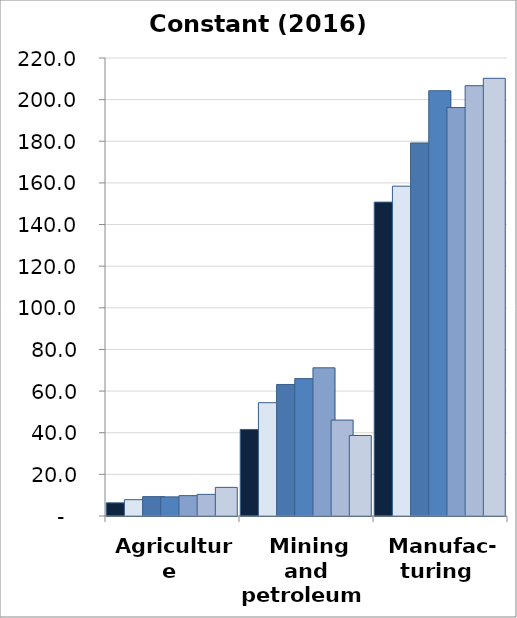
| Category | 2010 | 2011 | 2012 | 2013 | 2014 | 2015 | 2016 |
|---|---|---|---|---|---|---|---|
| Agriculture | 6.323 | 7.83 | 9.3 | 9.194 | 9.78 | 10.387 | 13.751 |
| Mining and
petroleum | 41.572 | 54.428 | 63.178 | 65.996 | 71.178 | 46.081 | 38.678 |
| Manufac-
turing | 150.773 | 158.429 | 179.196 | 204.272 | 196.196 | 206.693 | 210.249 |